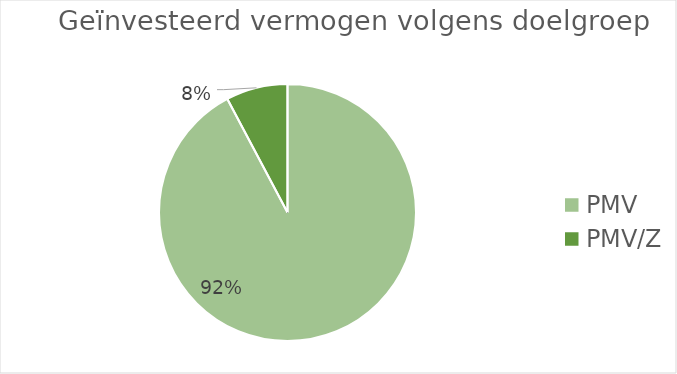
| Category | Series 0 |
|---|---|
| PMV | 579.782 |
| PMV/Z | 48.767 |